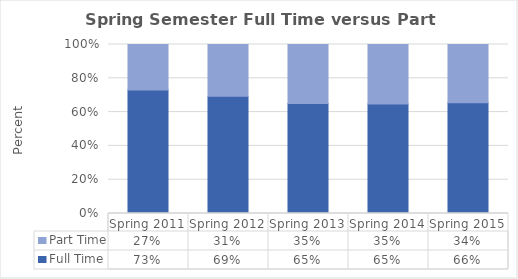
| Category | Full Time | Part Time |
|---|---|---|
| Spring 2011 | 0.731 | 0.269 |
| Spring 2012 | 0.694 | 0.306 |
| Spring 2013 | 0.65 | 0.35 |
| Spring 2014 | 0.649 | 0.351 |
| Spring 2015 | 0.655 | 0.345 |